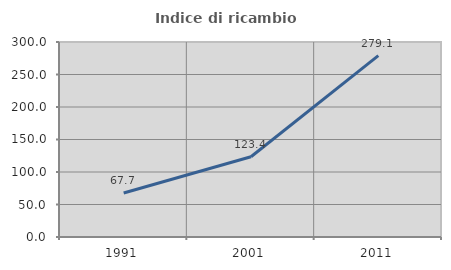
| Category | Indice di ricambio occupazionale  |
|---|---|
| 1991.0 | 67.682 |
| 2001.0 | 123.441 |
| 2011.0 | 279.119 |